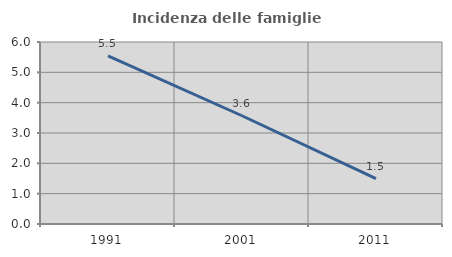
| Category | Incidenza delle famiglie numerose |
|---|---|
| 1991.0 | 5.546 |
| 2001.0 | 3.569 |
| 2011.0 | 1.499 |